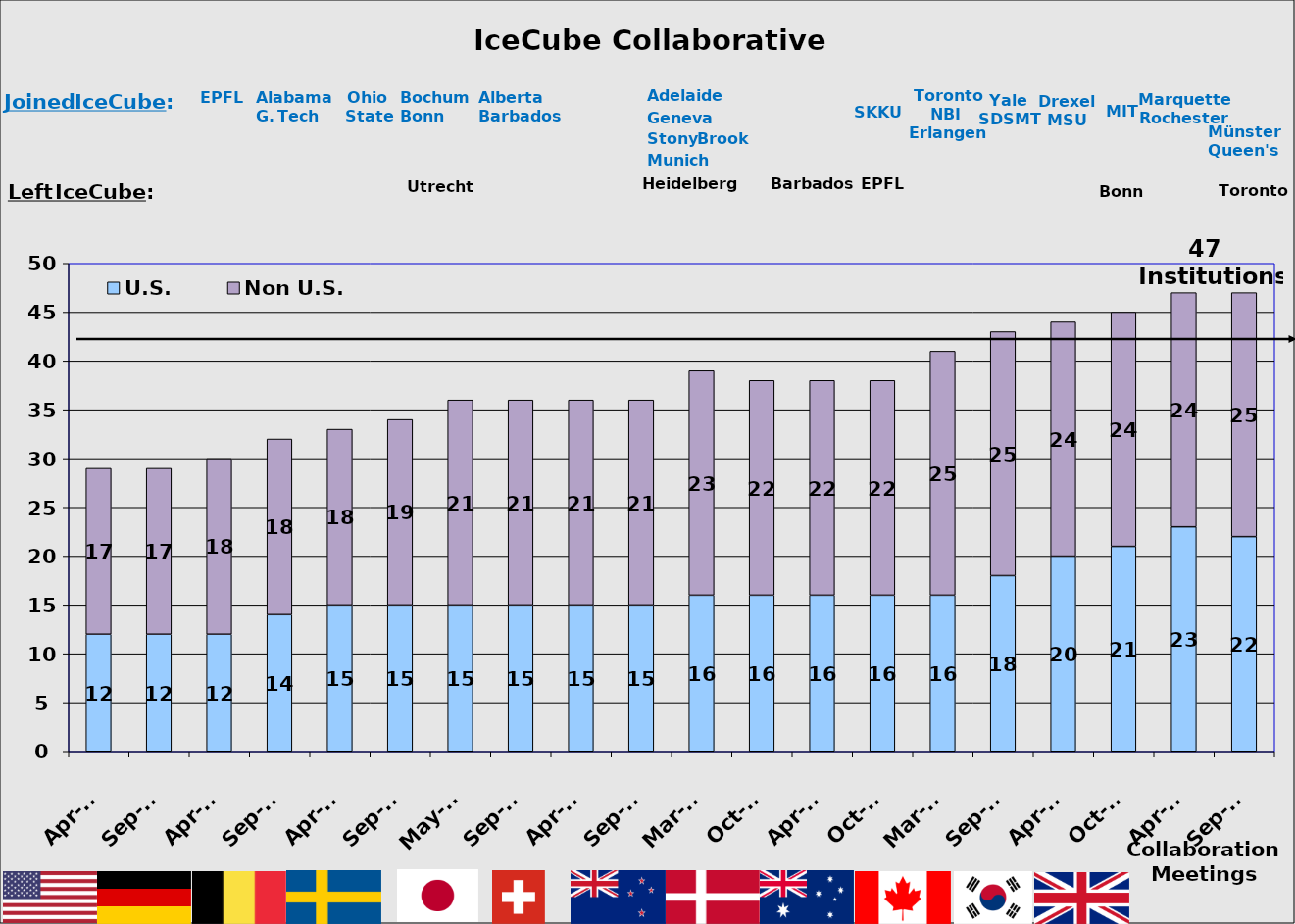
| Category | U.S. | Non U.S. |
|---|---|---|
| Apr-07 | 12 | 17 |
| Sep-07 | 12 | 17 |
| Apr-08 | 12 | 18 |
| Sep-08 | 14 | 18 |
| Apr-09 | 15 | 18 |
| Sep-09 | 15 | 19 |
| May-10 | 15 | 21 |
| Sep-10 | 15 | 21 |
| Apr-11 | 15 | 21 |
| Sep-11 | 15 | 21 |
| Mar-12 | 16 | 23 |
| Oct-12 | 16 | 22 |
| Apr-13 | 16 | 22 |
| Oct-13 | 16 | 22 |
| Mar-14 | 16 | 25 |
| Sep-14 | 18 | 25 |
| Apr-15 | 20 | 24 |
| Oct-15 | 21 | 24 |
| Apr-16 | 23 | 24 |
| Sep-16 | 22 | 25 |